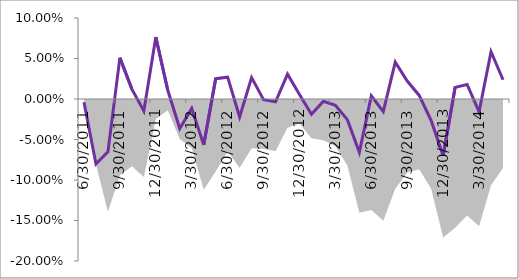
| Category | Series 1 |
|---|---|
| 0 | -0.004 |
| 01/01/1900 | -0.08 |
| 02/01/1900 | -0.065 |
| 03/01/1900 | 0.051 |
| 04/01/1900 | 0.012 |
| 05/01/1900 | -0.015 |
| 06/01/1900 | 0.076 |
| 07/01/1900 | 0.011 |
| 08/01/1900 | -0.036 |
| 09/01/1900 | -0.012 |
| 10/01/1900 | -0.057 |
| 11/01/1900 | 0.025 |
| 12/01/1900 | 0.027 |
| 13/01/1900 | -0.022 |
| 14/01/1900 | 0.026 |
| 15/01/1900 | -0.001 |
| 16/01/1900 | -0.003 |
| 17/01/1900 | 0.031 |
| 18/01/1900 | 0.005 |
| 19/01/1900 | -0.019 |
| 20/01/1900 | -0.003 |
| 21/01/1900 | -0.008 |
| 22/01/1900 | -0.026 |
| 23/01/1900 | -0.066 |
| 24/01/1900 | 0.004 |
| 25/01/1900 | -0.016 |
| 26/01/1900 | 0.046 |
| 27/01/1900 | 0.022 |
| 28/01/1900 | 0.004 |
| 29/01/1900 | -0.027 |
| 30/01/1900 | -0.07 |
| 31/01/1900 | 0.014 |
| 01/02/1900 | 0.018 |
| 02/02/1900 | -0.016 |
| 03/02/1900 | 0.058 |
| 04/02/1900 | 0.024 |